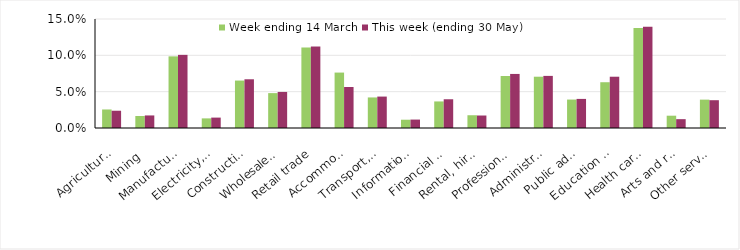
| Category | Week ending 14 March | This week (ending 30 May) |
|---|---|---|
| Agriculture, forestry and fishing | 0.026 | 0.024 |
| Mining | 0.017 | 0.017 |
| Manufacturing | 0.099 | 0.101 |
| Electricity, gas, water and waste services | 0.013 | 0.014 |
| Construction | 0.065 | 0.067 |
| Wholesale trade | 0.048 | 0.05 |
| Retail trade | 0.111 | 0.112 |
| Accommodation and food services | 0.076 | 0.056 |
| Transport, postal and warehousing | 0.042 | 0.043 |
| Information media and telecommunications | 0.011 | 0.012 |
| Financial and insurance services | 0.037 | 0.04 |
| Rental, hiring and real estate services | 0.018 | 0.017 |
| Professional, scientific and technical services | 0.072 | 0.074 |
| Administrative and support services | 0.071 | 0.072 |
| Public administration and safety | 0.039 | 0.04 |
| Education and training | 0.063 | 0.071 |
| Health care and social assistance | 0.137 | 0.139 |
| Arts and recreation services | 0.017 | 0.012 |
| Other services | 0.039 | 0.038 |